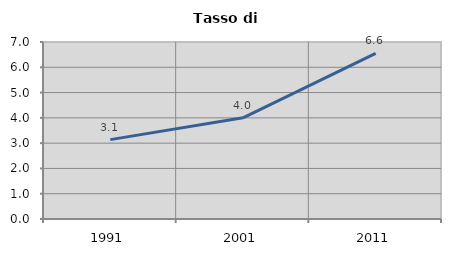
| Category | Tasso di disoccupazione   |
|---|---|
| 1991.0 | 3.14 |
| 2001.0 | 4.002 |
| 2011.0 | 6.553 |